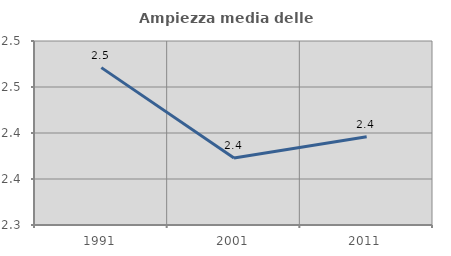
| Category | Ampiezza media delle famiglie |
|---|---|
| 1991.0 | 2.471 |
| 2001.0 | 2.373 |
| 2011.0 | 2.396 |